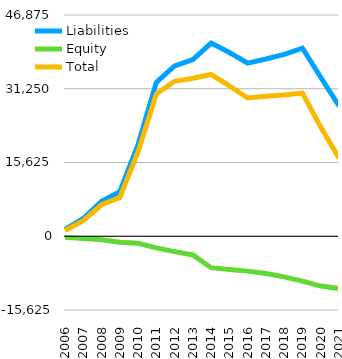
| Category | Liabilities  | Equity  | Total  |
|---|---|---|---|
| 2006 | 1433 | -238 | 1195 |
| 2007 | 3764 | -470 | 3294 |
| 2008 | 7418 | -750 | 6668 |
| 2009 | 9455 | -1260 | 8195 |
| 2010 | 19422 | -1503 | 17919 |
| 2011 | 32594 | -2457 | 30137 |
| 2012 | 36088 | -3249 | 32839 |
| 2013 | 37449 | -3958 | 33491 |
| 2014 | 40938 | -6658 | 34280 |
| 2015 | 38930 | -7054 | 31876 |
| 2016 | 36686 | -7387 | 29299 |
| 2017 | 37557 | -7892 | 29665 |
| 2018 | 38531 | -8597 | 29934 |
| 2019 | 39842 | -9505 | 30337 |
| 2020 | 33680 | -10559 | 23121 |
| 2021 | 27605 | -11072 | 16533 |